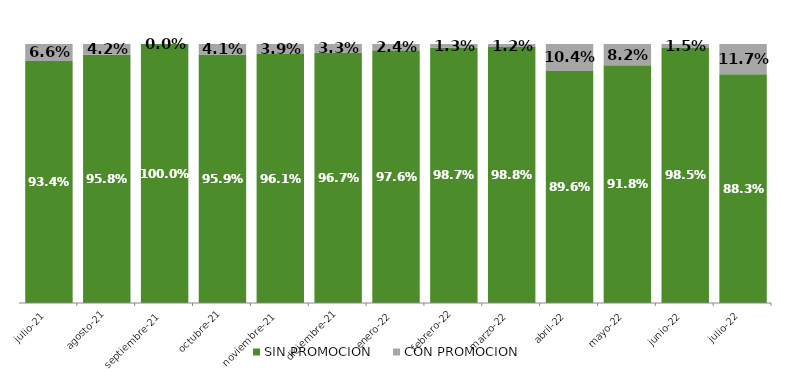
| Category | SIN PROMOCION   | CON PROMOCION   |
|---|---|---|
| 2021-07-01 | 0.934 | 0.066 |
| 2021-08-01 | 0.958 | 0.042 |
| 2021-09-01 | 1 | 0 |
| 2021-10-01 | 0.959 | 0.041 |
| 2021-11-01 | 0.961 | 0.039 |
| 2021-12-01 | 0.967 | 0.033 |
| 2022-01-01 | 0.976 | 0.024 |
| 2022-02-01 | 0.987 | 0.013 |
| 2022-03-01 | 0.988 | 0.012 |
| 2022-04-01 | 0.896 | 0.104 |
| 2022-05-01 | 0.918 | 0.082 |
| 2022-06-01 | 0.985 | 0.015 |
| 2022-07-01 | 0.883 | 0.117 |